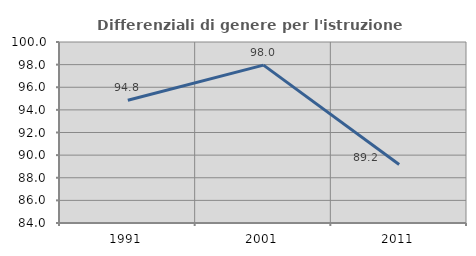
| Category | Differenziali di genere per l'istruzione superiore |
|---|---|
| 1991.0 | 94.844 |
| 2001.0 | 97.959 |
| 2011.0 | 89.172 |